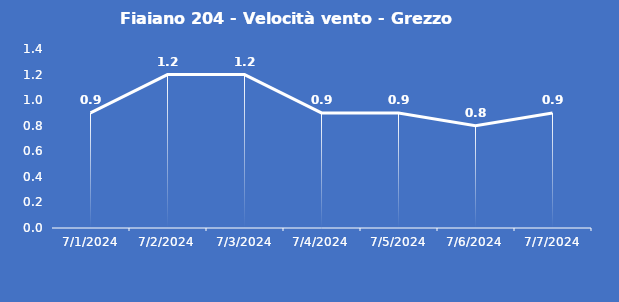
| Category | Fiaiano 204 - Velocità vento - Grezzo (m/s) |
|---|---|
| 7/1/24 | 0.9 |
| 7/2/24 | 1.2 |
| 7/3/24 | 1.2 |
| 7/4/24 | 0.9 |
| 7/5/24 | 0.9 |
| 7/6/24 | 0.8 |
| 7/7/24 | 0.9 |